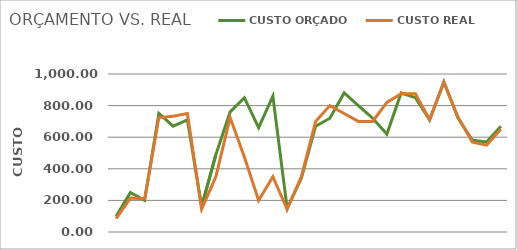
| Category | CUSTO ORÇADO | CUSTO REAL |
|---|---|---|
| 0 | 100 | 85 |
| 1 | 250 | 215 |
| 2 | 200 | 210 |
| 3 | 750 | 724 |
| 4 | 670 | 733 |
| 5 | 710 | 750 |
| 6 | 160 | 145 |
| 7 | 490 | 350 |
| 8 | 760 | 725 |
| 9 | 850 | 475 |
| 10 | 660 | 200 |
| 11 | 860 | 350 |
| 12 | 150 | 144 |
| 13 | 340 | 350 |
| 14 | 670 | 700 |
| 15 | 720 | 800 |
| 16 | 880 | 750 |
| 17 | 800 | 700 |
| 18 | 720 | 700 |
| 19 | 620 | 820 |
| 20 | 880 | 875 |
| 21 | 850 | 875 |
| 22 | 710 | 710 |
| 23 | 950 | 949 |
| 24 | 720 | 725 |
| 25 | 580 | 569 |
| 26 | 570 | 550 |
| 27 | 670 | 650 |